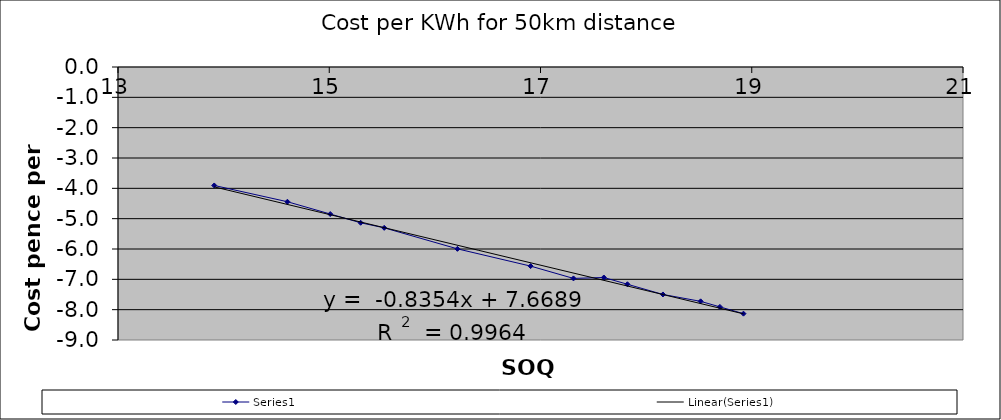
| Category | Series 0 |
|---|---|
| 18.921456031864853 | -8.132 |
| 18.698312480550644 | -7.908 |
| 18.51599092375669 | -7.726 |
| 18.159315979817958 | -7.499 |
| 17.822843743196746 | -7.162 |
| 17.599700191882537 | -6.939 |
| 17.312018119430753 | -6.97 |
| 16.90655301132259 | -6.564 |
| 16.213405830762646 | -5.995 |
| 15.520258650202699 | -5.302 |
| 15.29711509888849 | -5.135 |
| 15.009433026436708 | -4.847 |
| 14.603967918328545 | -4.442 |
| 13.9108207377686 | -3.905 |